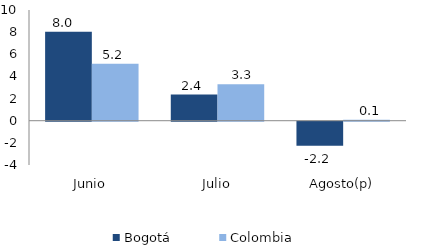
| Category | Bogotá | Colombia |
|---|---|---|
| Junio | 8.039 | 5.151 |
| Julio | 2.362 | 3.302 |
| Agosto(p) | -2.176 | 0.087 |